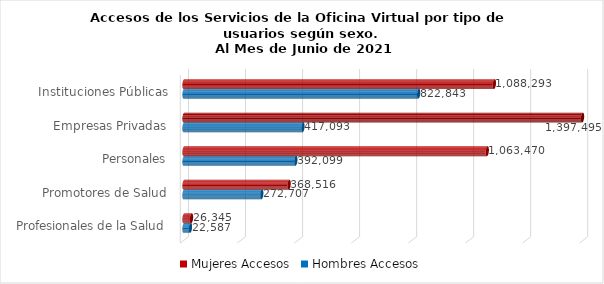
| Category | Mujeres | Hombres |
|---|---|---|
| Instituciones Públicas | 1088293 | 822843 |
| Empresas Privadas | 1397495 | 417093 |
| Personales | 1063470 | 392099 |
| Promotores de Salud | 368516 | 272707 |
| Profesionales de la Salud | 26345 | 22587 |